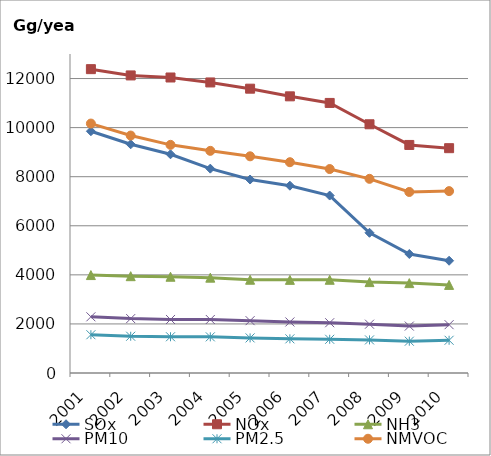
| Category | SOx | NOx | NH3 | PM10 | PM2.5 | NMVOC |
|---|---|---|---|---|---|---|
| 2001.0 | 9853.039 | 12382.374 | 3990.673 | 2289.796 | 1559.608 | 10165.014 |
| 2002.0 | 9320.449 | 12126.981 | 3945.453 | 2216.884 | 1497.862 | 9676.709 |
| 2003.0 | 8913.825 | 12042.602 | 3922.71 | 2181.07 | 1477.03 | 9297.45 |
| 2004.0 | 8327.914 | 11840.729 | 3885.296 | 2180.419 | 1473.379 | 9053.236 |
| 2005.0 | 7884.379 | 11586.826 | 3801.042 | 2132.903 | 1430.531 | 8830.607 |
| 2006.0 | 7632.923 | 11274.807 | 3795.307 | 2079.866 | 1392.464 | 8590.708 |
| 2007.0 | 7231.993 | 11006.275 | 3799.08 | 2048.476 | 1373.886 | 8311.611 |
| 2008.0 | 5714.721 | 10136.461 | 3704.632 | 1988.876 | 1348.067 | 7912.908 |
| 2009.0 | 4849.815 | 9293.454 | 3663.173 | 1912.116 | 1295.48 | 7377.591 |
| 2010.0 | 4574.478 | 9162.264 | 3590.605 | 1969.305 | 1333.394 | 7412.004 |